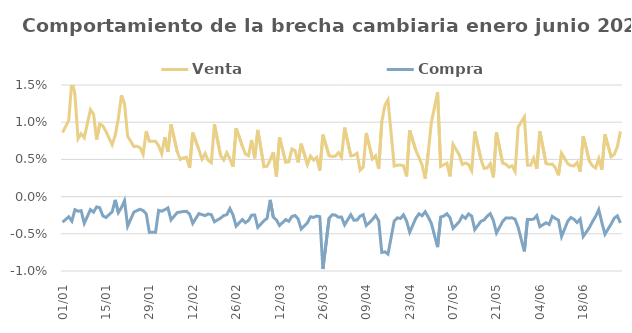
| Category | Venta | Compra |
|---|---|---|
| 2022-01-01 | 0.009 | -0.003 |
| 2022-01-03 | 0.01 | -0.003 |
| 2022-01-04 | 0.016 | -0.003 |
| 2022-01-05 | 0.014 | -0.002 |
| 2022-01-06 | 0.008 | -0.002 |
| 2022-01-07 | 0.008 | -0.002 |
| 2022-01-08 | 0.008 | -0.004 |
| 2022-01-10 | 0.012 | -0.002 |
| 2022-01-11 | 0.011 | -0.002 |
| 2022-01-12 | 0.008 | -0.001 |
| 2022-01-13 | 0.01 | -0.001 |
| 2022-01-14 | 0.01 | -0.003 |
| 2022-01-15 | 0.009 | -0.003 |
| 2022-01-17 | 0.007 | -0.002 |
| 2022-01-18 | 0.008 | 0 |
| 2022-01-19 | 0.011 | -0.002 |
| 2022-01-20 | 0.014 | -0.001 |
| 2022-01-21 | 0.012 | -0.001 |
| 2022-01-22 | 0.008 | -0.004 |
| 2022-01-24 | 0.007 | -0.002 |
| 2022-01-25 | 0.007 | -0.002 |
| 2022-01-26 | 0.007 | -0.002 |
| 2022-01-27 | 0.006 | -0.002 |
| 2022-01-28 | 0.009 | -0.002 |
| 2022-01-29 | 0.007 | -0.005 |
| 2022-01-31 | 0.007 | -0.005 |
| 2022-02-01 | 0.007 | -0.002 |
| 2022-02-02 | 0.006 | -0.002 |
| 2022-02-03 | 0.008 | -0.002 |
| 2022-02-04 | 0.006 | -0.002 |
| 2022-02-05 | 0.01 | -0.003 |
| 2022-02-07 | 0.006 | -0.002 |
| 2022-02-08 | 0.005 | -0.002 |
| 2022-02-09 | 0.005 | -0.002 |
| 2022-02-10 | 0.005 | -0.002 |
| 2022-02-11 | 0.004 | -0.002 |
| 2022-02-12 | 0.009 | -0.004 |
| 2022-02-14 | 0.006 | -0.002 |
| 2022-02-15 | 0.005 | -0.002 |
| 2022-02-16 | 0.006 | -0.003 |
| 2022-02-17 | 0.005 | -0.002 |
| 2022-02-18 | 0.005 | -0.002 |
| 2022-02-19 | 0.01 | -0.003 |
| 2022-02-21 | 0.006 | -0.003 |
| 2022-02-22 | 0.005 | -0.003 |
| 2022-02-23 | 0.006 | -0.002 |
| 2022-02-24 | 0.005 | -0.002 |
| 2022-02-25 | 0.004 | -0.002 |
| 2022-02-26 | 0.009 | -0.004 |
| 2022-02-28 | 0.007 | -0.003 |
| 2022-03-01 | 0.006 | -0.004 |
| 2022-03-02 | 0.005 | -0.003 |
| 2022-03-03 | 0.008 | -0.002 |
| 2022-03-04 | 0.005 | -0.002 |
| 2022-03-05 | 0.009 | -0.004 |
| 2022-03-07 | 0.004 | -0.003 |
| 2022-03-08 | 0.004 | -0.003 |
| 2022-03-09 | 0.005 | 0 |
| 2022-03-10 | 0.006 | -0.003 |
| 2022-03-11 | 0.003 | -0.003 |
| 2022-03-12 | 0.008 | -0.004 |
| 2022-03-14 | 0.005 | -0.003 |
| 2022-03-15 | 0.005 | -0.003 |
| 2022-03-16 | 0.006 | -0.003 |
| 2022-03-17 | 0.006 | -0.003 |
| 2022-03-18 | 0.005 | -0.003 |
| 2022-03-19 | 0.007 | -0.004 |
| 2022-03-21 | 0.004 | -0.004 |
| 2022-03-22 | 0.005 | -0.003 |
| 2022-03-23 | 0.005 | -0.003 |
| 2022-03-24 | 0.005 | -0.003 |
| 2022-03-25 | 0.003 | -0.003 |
| 2022-03-26 | 0.008 | -0.01 |
| 2022-03-28 | 0.006 | -0.003 |
| 2022-03-29 | 0.005 | -0.002 |
| 2022-03-30 | 0.005 | -0.002 |
| 2022-03-31 | 0.006 | -0.003 |
| 2022-04-01 | 0.005 | -0.003 |
| 2022-04-02 | 0.009 | -0.004 |
| 2022-04-04 | 0.005 | -0.002 |
| 2022-04-05 | 0.006 | -0.003 |
| 2022-04-06 | 0.006 | -0.003 |
| 2022-04-07 | 0.004 | -0.003 |
| 2022-04-08 | 0.004 | -0.002 |
| 2022-04-09 | 0.009 | -0.004 |
| 2022-04-11 | 0.005 | -0.003 |
| 2022-04-12 | 0.005 | -0.003 |
| 2022-04-13 | 0.004 | -0.003 |
| 2022-04-14 | 0.01 | -0.008 |
| 2022-04-15 | 0.012 | -0.007 |
| 2022-04-16 | 0.013 | -0.008 |
| 2022-04-18 | 0.004 | -0.003 |
| 2022-04-19 | 0.004 | -0.003 |
| 2022-04-20 | 0.004 | -0.003 |
| 2022-04-21 | 0.004 | -0.002 |
| 2022-04-22 | 0.003 | -0.003 |
| 2022-04-23 | 0.009 | -0.005 |
| 2022-04-25 | 0.006 | -0.003 |
| 2022-04-26 | 0.005 | -0.002 |
| 2022-04-27 | 0.004 | -0.003 |
| 2022-04-28 | 0.002 | -0.002 |
| 2022-04-29 | 0.006 | -0.003 |
| 2022-04-30 | 0.01 | -0.004 |
| 2022-05-02 | 0.014 | -0.007 |
| 2022-05-03 | 0.004 | -0.003 |
| 2022-05-04 | 0.004 | -0.003 |
| 2022-05-05 | 0.005 | -0.002 |
| 2022-05-06 | 0.003 | -0.003 |
| 2022-05-07 | 0.007 | -0.004 |
| 2022-05-09 | 0.006 | -0.003 |
| 2022-05-10 | 0.004 | -0.003 |
| 2022-05-11 | 0.005 | -0.003 |
| 2022-05-12 | 0.004 | -0.002 |
| 2022-05-13 | 0.003 | -0.003 |
| 2022-05-14 | 0.009 | -0.004 |
| 2022-05-16 | 0.005 | -0.003 |
| 2022-05-17 | 0.004 | -0.003 |
| 2022-05-18 | 0.004 | -0.003 |
| 2022-05-19 | 0.004 | -0.002 |
| 2022-05-20 | 0.003 | -0.003 |
| 2022-05-21 | 0.009 | -0.005 |
| 2022-05-23 | 0.004 | -0.003 |
| 2022-05-24 | 0.004 | -0.003 |
| 2022-05-25 | 0.004 | -0.003 |
| 2022-05-26 | 0.004 | -0.003 |
| 2022-05-27 | 0.003 | -0.003 |
| 2022-05-28 | 0.009 | -0.004 |
| 2022-05-30 | 0.011 | -0.007 |
| 2022-05-31 | 0.004 | -0.003 |
| 2022-06-01 | 0.004 | -0.003 |
| 2022-06-02 | 0.005 | -0.003 |
| 2022-06-03 | 0.004 | -0.003 |
| 2022-06-04 | 0.009 | -0.004 |
| 2022-06-06 | 0.004 | -0.004 |
| 2022-06-07 | 0.004 | -0.004 |
| 2022-06-08 | 0.004 | -0.003 |
| 2022-06-09 | 0.004 | -0.003 |
| 2022-06-10 | 0.003 | -0.003 |
| 2022-06-11 | 0.006 | -0.005 |
| 2022-06-13 | 0.004 | -0.003 |
| 2022-06-14 | 0.004 | -0.003 |
| 2022-06-15 | 0.004 | -0.003 |
| 2022-06-16 | 0.005 | -0.003 |
| 2022-06-17 | 0.003 | -0.003 |
| 2022-06-18 | 0.008 | -0.005 |
| 2022-06-20 | 0.005 | -0.004 |
| 2022-06-21 | 0.004 | -0.003 |
| 2022-06-22 | 0.004 | -0.003 |
| 2022-06-23 | 0.005 | -0.002 |
| 2022-06-24 | 0.004 | -0.003 |
| 2022-06-25 | 0.008 | -0.005 |
| 2022-06-27 | 0.005 | -0.004 |
| 2022-06-28 | 0.006 | -0.003 |
| 2022-06-29 | 0.007 | -0.003 |
| 2022-06-30 | 0.009 | -0.004 |